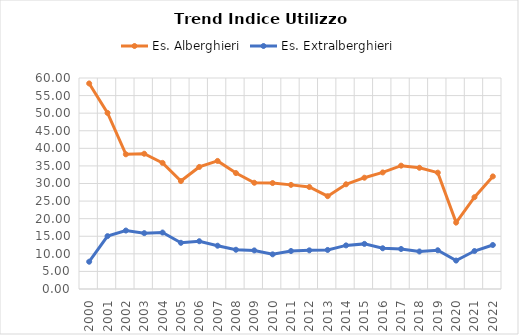
| Category | Es. Alberghieri | Es. Extralberghieri |
|---|---|---|
| 2000.0 | 58.45 | 7.756 |
| 2001.0 | 50.072 | 15.032 |
| 2002.0 | 38.303 | 16.622 |
| 2003.0 | 38.459 | 15.885 |
| 2004.0 | 35.861 | 16.057 |
| 2005.0 | 30.694 | 13.138 |
| 2006.0 | 34.708 | 13.586 |
| 2007.0 | 36.417 | 12.309 |
| 2008.0 | 32.967 | 11.165 |
| 2009.0 | 30.213 | 10.972 |
| 2010.0 | 30.127 | 9.857 |
| 2011.0 | 29.608 | 10.803 |
| 2012.0 | 29.004 | 10.993 |
| 2013.0 | 26.397 | 11.105 |
| 2014.0 | 29.776 | 12.401 |
| 2015.0 | 31.648 | 12.828 |
| 2016.0 | 33.145 | 11.584 |
| 2017.0 | 35.073 | 11.379 |
| 2018.0 | 34.469 | 10.666 |
| 2019.0 | 33.086 | 11.014 |
| 2020.0 | 18.892 | 8.086 |
| 2021.0 | 26.101 | 10.795 |
| 2022.0 | 32.012 | 12.511 |